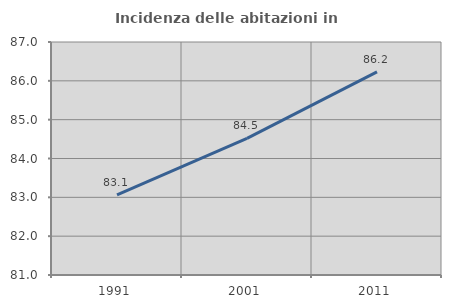
| Category | Incidenza delle abitazioni in proprietà  |
|---|---|
| 1991.0 | 83.066 |
| 2001.0 | 84.518 |
| 2011.0 | 86.229 |